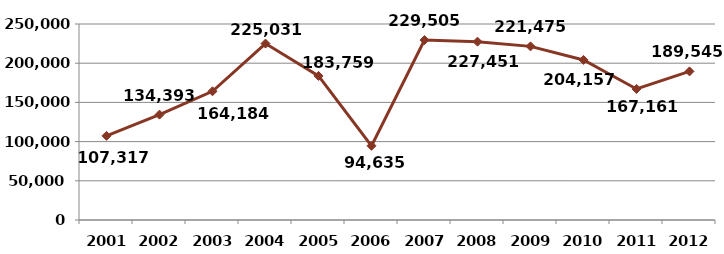
| Category | Series 0 |
|---|---|
| 2001.0 | 107317 |
| 2002.0 | 134393 |
| 2003.0 | 164184 |
| 2004.0 | 225031 |
| 2005.0 | 183759 |
| 2006.0 | 94635 |
| 2007.0 | 229505 |
| 2008.0 | 227451 |
| 2009.0 | 221475 |
| 2010.0 | 204157 |
| 2011.0 | 167161 |
| 2012.0 | 189545 |